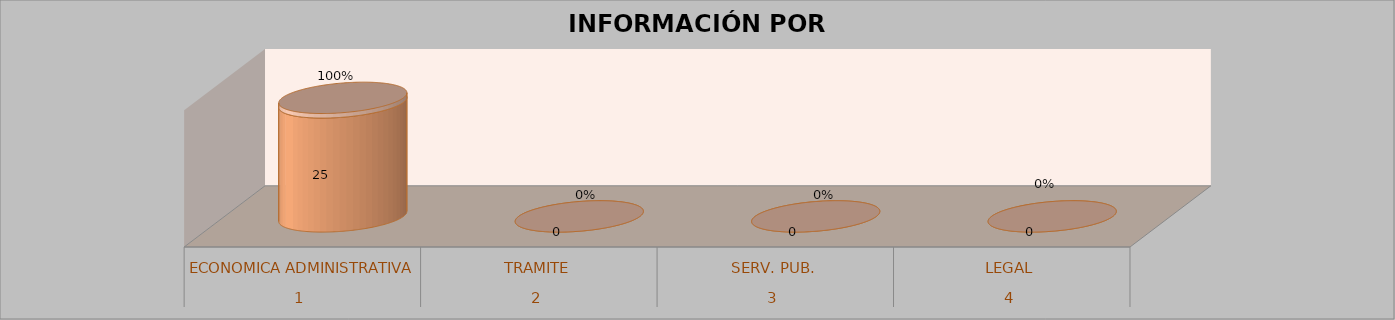
| Category | Series 0 | Series 1 | Series 2 | Series 3 |
|---|---|---|---|---|
| 0 |  |  | 25 | 1 |
| 1 |  |  | 0 | 0 |
| 2 |  |  | 0 | 0 |
| 3 |  |  | 0 | 0 |